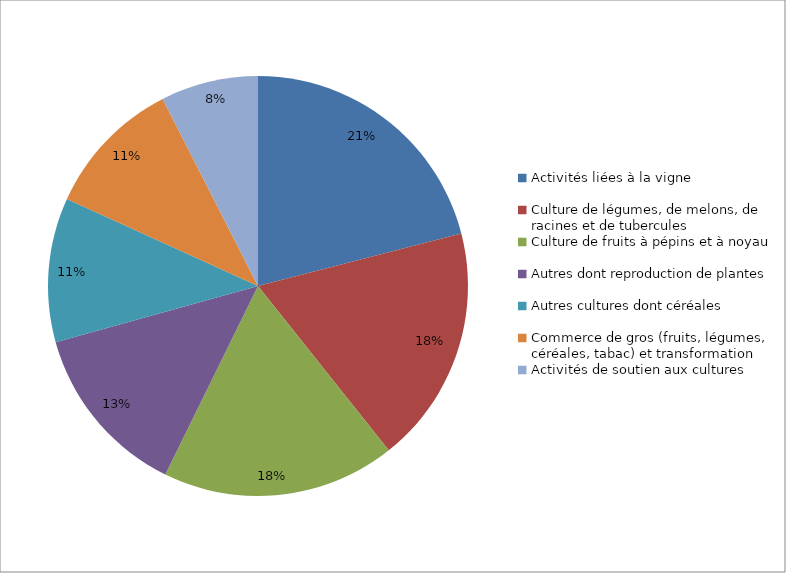
| Category | Series 0 |
|---|---|
| Activités liées à la vigne | 0.21 |
| Culture de légumes, de melons, de racines et de tubercules | 0.183 |
| Culture de fruits à pépins et à noyau | 0.18 |
| Autres dont reproduction de plantes | 0.134 |
| Autres cultures dont céréales | 0.111 |
| Commerce de gros (fruits, légumes, céréales, tabac) et transformation | 0.107 |
| Activités de soutien aux cultures | 0.075 |